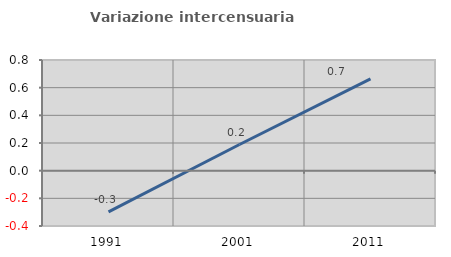
| Category | Variazione intercensuaria annua |
|---|---|
| 1991.0 | -0.297 |
| 2001.0 | 0.189 |
| 2011.0 | 0.663 |